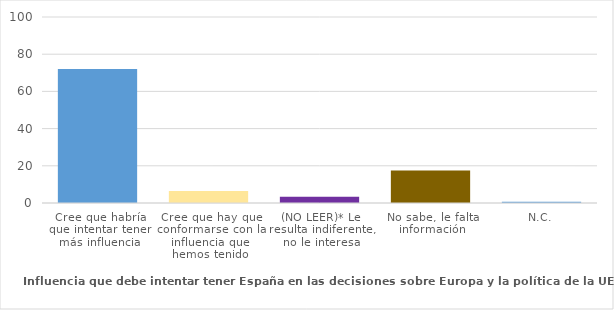
| Category | Series 0 |
|---|---|
| Cree que habría que intentar tener más influencia | 72 |
| Cree que hay que conformarse con la influencia que hemos tenido | 6.4 |
| (NO LEER)* Le resulta indiferente, no le interesa | 3.4 |
| No sabe, le falta información | 17.5 |
| N.C. | 0.7 |